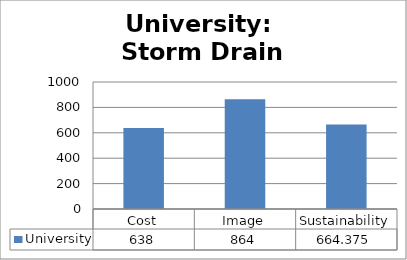
| Category | University |
|---|---|
| Cost | 638 |
| Image | 864 |
| Sustainability | 664.375 |